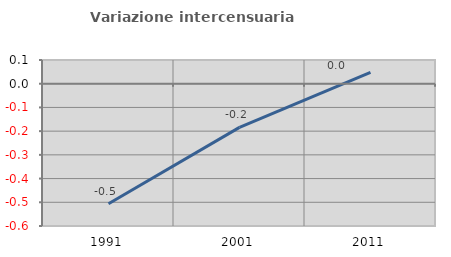
| Category | Variazione intercensuaria annua |
|---|---|
| 1991.0 | -0.506 |
| 2001.0 | -0.184 |
| 2011.0 | 0.048 |